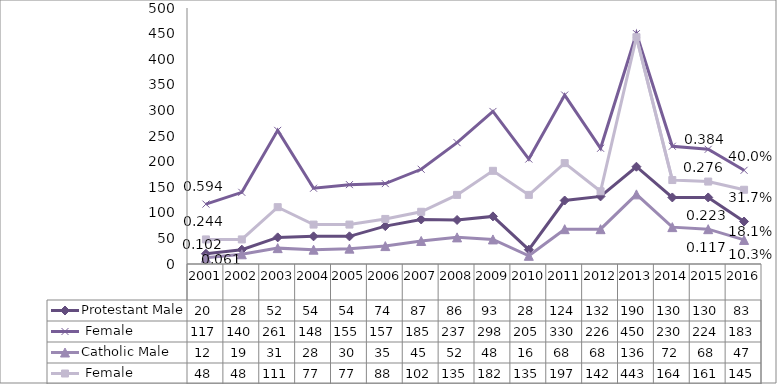
| Category | Protestant | Catholic |
|---|---|---|
| 2001.0 | 117 | 48 |
| 2002.0 | 140 | 48 |
| 2003.0 | 261 | 111 |
| 2004.0 | 148 | 77 |
| 2005.0 | 155 | 77 |
| 2006.0 | 157 | 88 |
| 2007.0 | 185 | 102 |
| 2008.0 | 237 | 135 |
| 2009.0 | 298 | 182 |
| 2010.0 | 205 | 135 |
| 2011.0 | 330 | 197 |
| 2012.0 | 226 | 142 |
| 2013.0 | 450 | 443 |
| 2014.0 | 230 | 164 |
| 2015.0 | 224 | 161 |
| 2016.0 | 183 | 145 |